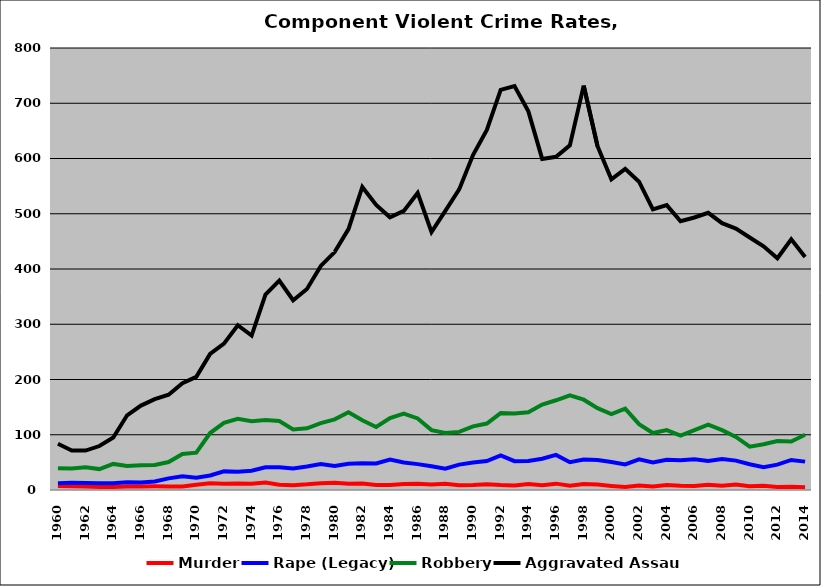
| Category | Murder | Rape (Legacy) | Robbery | Aggravated Assault |
|---|---|---|---|---|
| 1960.0 | 7.36 | 12.303 | 39.536 | 83.804 |
| 1961.0 | 6.816 | 12.92 | 38.759 | 71.516 |
| 1962.0 | 6.275 | 12.451 | 41.078 | 71.373 |
| 1963.0 | 5.599 | 12.181 | 37.819 | 79.568 |
| 1964.0 | 5.556 | 12.302 | 47.222 | 94.94 |
| 1965.0 | 6.317 | 13.8 | 43.635 | 135.18 |
| 1966.0 | 6.262 | 13.503 | 44.814 | 152.74 |
| 1967.0 | 6.58 | 15.454 | 45.464 | 164.307 |
| 1968.0 | 6.404 | 21.084 | 50.542 | 172.512 |
| 1969.0 | 6.338 | 25.05 | 65.091 | 193.36 |
| 1970.0 | 9.646 | 22.343 | 67.618 | 204.823 |
| 1971.0 | 12.039 | 26.214 | 103.107 | 246.408 |
| 1972.0 | 11.455 | 33.709 | 121.596 | 264.977 |
| 1973.0 | 11.754 | 33.092 | 128.752 | 298.282 |
| 1974.0 | 11.319 | 34.848 | 124.599 | 279.59 |
| 1975.0 | 13.339 | 40.976 | 126.678 | 353.793 |
| 1976.0 | 9.675 | 41.01 | 124.743 | 378.938 |
| 1977.0 | 8.824 | 39.076 | 109.58 | 343.445 |
| 1978.0 | 10.231 | 42.657 | 111.551 | 363.779 |
| 1979.0 | 12.409 | 46.898 | 121.031 | 405.641 |
| 1980.0 | 13.123 | 43.305 | 127.907 | 430.653 |
| 1981.0 | 11.379 | 47.325 | 140.769 | 472.193 |
| 1982.0 | 11.626 | 48.271 | 126.196 | 548.418 |
| 1983.0 | 8.863 | 47.963 | 114.01 | 515.94 |
| 1984.0 | 9.129 | 54.986 | 130.337 | 493.61 |
| 1985.0 | 10.897 | 49.793 | 138.138 | 505.103 |
| 1986.0 | 11.494 | 46.856 | 129.547 | 537.661 |
| 1987.0 | 10.133 | 43.067 | 108.333 | 466.933 |
| 1988.0 | 11.457 | 38.411 | 103.113 | 505.166 |
| 1989.0 | 8.639 | 45.942 | 105.17 | 544.11 |
| 1990.0 | 9.174 | 49.701 | 115.11 | 606.243 |
| 1991.0 | 10.53 | 52.39 | 120.284 | 651.55 |
| 1992.0 | 8.918 | 62.619 | 139.279 | 724.099 |
| 1993.0 | 8.045 | 52.104 | 138.428 | 731.126 |
| 1994.0 | 10.701 | 52.358 | 140.81 | 685.369 |
| 1995.0 | 8.783 | 56.617 | 154.54 | 599.288 |
| 1996.0 | 11.5 | 63.514 | 162.405 | 603.152 |
| 1997.0 | 7.746 | 50.405 | 171.445 | 623.699 |
| 1998.0 | 10.938 | 55.095 | 163.443 | 731.952 |
| 1999.0 | 9.771 | 54.258 | 148.232 | 622.297 |
| 2000.0 | 7.421 | 50.686 | 137.38 | 562.383 |
| 2001.0 | 5.407 | 46.424 | 147.193 | 581.342 |
| 2002.0 | 8.207 | 55.452 | 119.112 | 557.978 |
| 2003.0 | 6.175 | 50.038 | 103.111 | 507.942 |
| 2004.0 | 8.881 | 54.598 | 108.355 | 515.553 |
| 2005.0 | 7.477 | 54.05 | 98.287 | 486.504 |
| 2006.0 | 7.06 | 55.817 | 108.206 | 493.247 |
| 2007.0 | 9.442 | 52.54 | 118.279 | 501.748 |
| 2008.0 | 7.55 | 56.071 | 108.317 | 482.896 |
| 2009.0 | 9.852 | 53.193 | 96.135 | 473.212 |
| 2010.0 | 6.896 | 46.523 | 78.381 | 457.075 |
| 2011.0 | 7.601 | 41.18 | 82.745 | 441.147 |
| 2012.0 | 5.567 | 45.931 | 88.647 | 419.478 |
| 2013.0 | 5.894 | 54.387 | 87.786 | 453.784 |
| 2014.0 | 4.843 | 51.353 | 100.021 | 421.803 |